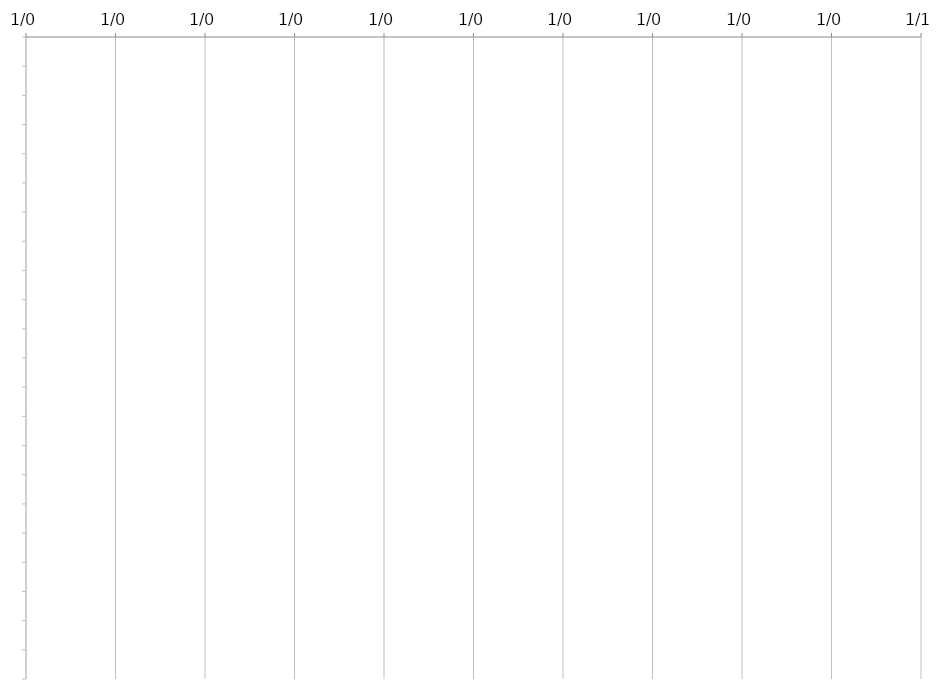
| Category | START | DAYS |
|---|---|---|
|  |  | 0 |
|  |  | 0 |
|  |  | 0 |
|  |  | 0 |
|  |  | 0 |
|  |  | 0 |
|  |  | 0 |
|  |  | 0 |
|  |  | 0 |
|  |  | 0 |
|  |  | 0 |
|  |  | 0 |
|  |  | 0 |
|  |  | 0 |
|  |  | 0 |
|  |  | 0 |
|  |  | 0 |
|  |  | 0 |
|  |  | 0 |
|  |  | 0 |
|  |  | 0 |
|  |  | 0 |